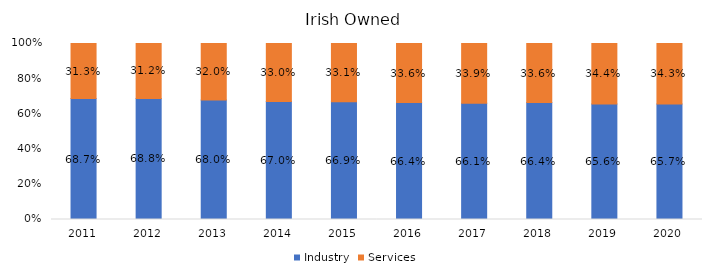
| Category | Industry | Services |
|---|---|---|
| 2011.0 | 0.687 | 0.313 |
| 2012.0 | 0.688 | 0.312 |
| 2013.0 | 0.68 | 0.32 |
| 2014.0 | 0.67 | 0.33 |
| 2015.0 | 0.669 | 0.331 |
| 2016.0 | 0.664 | 0.336 |
| 2017.0 | 0.661 | 0.339 |
| 2018.0 | 0.664 | 0.336 |
| 2019.0 | 0.656 | 0.344 |
| 2020.0 | 0.657 | 0.343 |